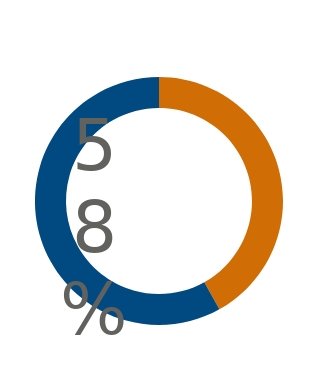
| Category | Series 0 |
|---|---|
| 0 | 0.419 |
| 1 | 0.581 |